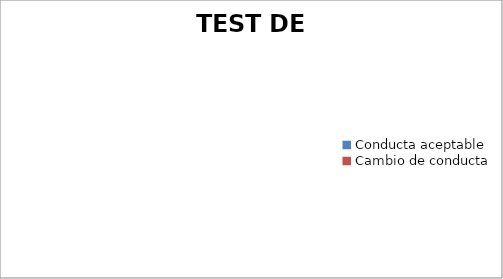
| Category | TEST DE ASERTIVIDAD |
|---|---|
| Conducta aceptable | 0 |
| Cambio de conducta | 0 |